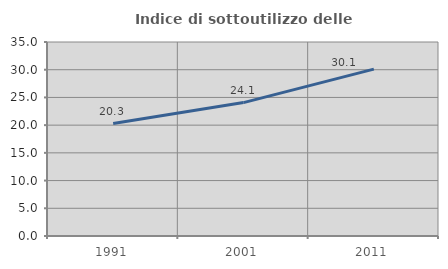
| Category | Indice di sottoutilizzo delle abitazioni  |
|---|---|
| 1991.0 | 20.286 |
| 2001.0 | 24.071 |
| 2011.0 | 30.11 |